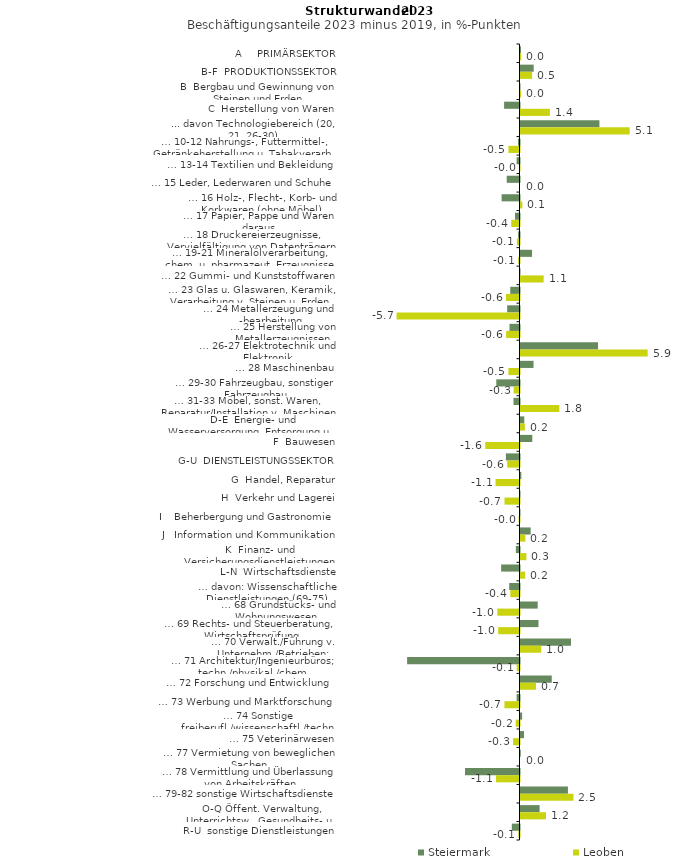
| Category | Steiermark | Leoben |
|---|---|---|
| A     PRIMÄRSEKTOR | 0.022 | 0.034 |
| B-F  PRODUKTIONSSEKTOR | 0.612 | 0.54 |
| B  Bergbau und Gewinnung von Steinen und Erden | -0.009 | 0.023 |
| C  Herstellung von Waren | -0.714 | 1.362 |
| ... davon Technologiebereich (20, 21, 26-30) | 3.66 | 5.063 |
| … 10-12 Nahrungs-, Futtermittel-, Getränkeherstellung u. Tabakverarb. | -0.068 | -0.514 |
| … 13-14 Textilien und Bekleidung | -0.134 | -0.021 |
| … 15 Leder, Lederwaren und Schuhe | -0.593 | 0 |
| … 16 Holz-, Flecht-, Korb- und Korkwaren (ohne Möbel)  | -0.83 | 0.082 |
| … 17 Papier, Pappe und Waren daraus  | -0.208 | -0.385 |
| … 18 Druckereierzeugnisse, Vervielfältigung von Datenträgern | -0.063 | -0.122 |
| … 19-21 Mineralölverarbeitung, chem. u. pharmazeut. Erzeugnisse | 0.535 | -0.061 |
| … 22 Gummi- und Kunststoffwaren | -0.02 | 1.074 |
| … 23 Glas u. Glaswaren, Keramik, Verarbeitung v. Steinen u. Erden  | -0.429 | -0.624 |
| … 24 Metallerzeugung und -bearbeitung | -0.572 | -5.702 |
| … 25 Herstellung von Metallerzeugnissen  | -0.464 | -0.62 |
| … 26-27 Elektrotechnik und Elektronik | 3.595 | 5.898 |
| … 28 Maschinenbau | 0.604 | -0.516 |
| … 29-30 Fahrzeugbau, sonstiger Fahrzeugbau | -1.076 | -0.274 |
| … 31-33 Möbel, sonst. Waren, Reparatur/Installation v. Maschinen | -0.279 | 1.801 |
| D-E  Energie- und Wasserversorgung, Entsorgung u. Rückgewinnung | 0.175 | 0.201 |
| F  Bauwesen | 0.547 | -1.587 |
| G-U  DIENSTLEISTUNGSSEKTOR | -0.633 | -0.569 |
| G  Handel, Reparatur | 0.038 | -1.112 |
| H  Verkehr und Lagerei | -0.011 | -0.696 |
| I    Beherbergung und Gastronomie | -0.007 | -0.041 |
| J   Information und Kommunikation | 0.471 | 0.223 |
| K  Finanz- und Versicherungsdienstleistungen | -0.168 | 0.273 |
| L-N  Wirtschaftsdienste | -0.853 | 0.217 |
| … davon: Wissenschaftliche Dienstleistungen (69-75) | -0.478 | -0.425 |
| … 68 Grundstücks- und Wohnungswesen  | 0.798 | -1.03 |
| … 69 Rechts- und Steuerberatung, Wirtschaftsprüfung | 0.834 | -0.988 |
| … 70 Verwalt./Führung v. Unternehm./Betrieben; Unternehmensberat. | 2.342 | 0.962 |
| … 71 Architektur/Ingenieurbüros; techn./physikal./chem. Untersuchung | -5.212 | -0.129 |
| … 72 Forschung und Entwicklung  | 1.449 | 0.719 |
| … 73 Werbung und Marktforschung | -0.133 | -0.699 |
| … 74 Sonstige freiberufl./wissenschaftl./techn. Tätigkeiten | 0.074 | -0.174 |
| … 75 Veterinärwesen | 0.163 | -0.295 |
| … 77 Vermietung von beweglichen Sachen  | 0.011 | 0 |
| … 78 Vermittlung und Überlassung von Arbeitskräften | -2.527 | -1.088 |
| … 79-82 sonstige Wirtschaftsdienste | 2.199 | 2.456 |
| O-Q Öffent. Verwaltung, Unterrichtsw., Gesundheits- u. Sozialwesen | 0.886 | 1.183 |
| R-U  sonstige Dienstleistungen | -0.355 | -0.055 |